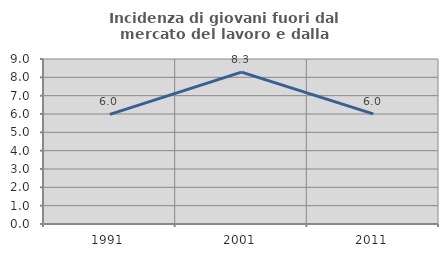
| Category | Incidenza di giovani fuori dal mercato del lavoro e dalla formazione  |
|---|---|
| 1991.0 | 5.981 |
| 2001.0 | 8.285 |
| 2011.0 | 6.008 |